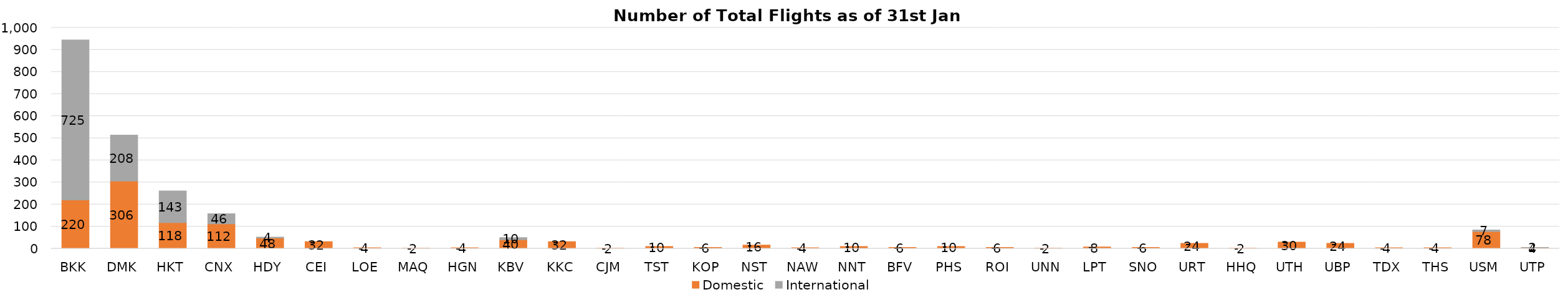
| Category | Domestic | International |
|---|---|---|
| BKK | 220 | 725 |
| DMK | 306 | 208 |
| HKT | 118 | 143 |
| CNX | 112 | 46 |
| HDY | 48 | 4 |
| CEI | 32 | 0 |
| LOE | 4 | 0 |
| MAQ | 2 | 0 |
| HGN | 4 | 0 |
| KBV | 40 | 10 |
| KKC | 32 | 0 |
| CJM | 2 | 0 |
| TST | 10 | 0 |
| KOP | 6 | 0 |
| NST | 16 | 0 |
| NAW | 4 | 0 |
| NNT | 10 | 0 |
| BFV | 6 | 0 |
| PHS | 10 | 0 |
| ROI | 6 | 0 |
| UNN | 2 | 0 |
| LPT | 8 | 0 |
| SNO | 6 | 0 |
| URT | 24 | 0 |
| HHQ | 2 | 0 |
| UTH | 30 | 0 |
| UBP | 24 | 0 |
| TDX | 4 | 0 |
| THS | 4 | 0 |
| USM | 78 | 7 |
| UTP | 4 | 2 |